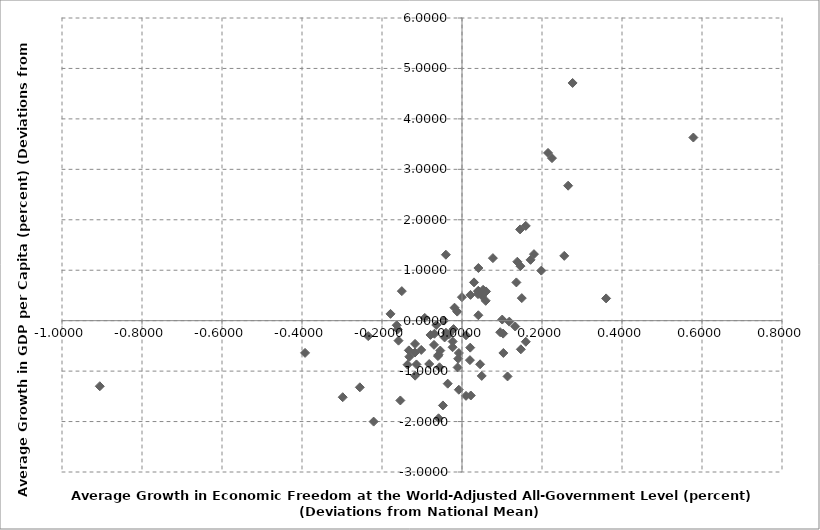
| Category | Series 0 |
|---|---|
| 0.021288192703214543 | 0.511 |
| -0.009559297445299944 | -0.755 |
| -0.06879234522613865 | -0.259 |
| -0.11760178874445776 | -0.632 |
| 0.2249677748700108 | 3.222 |
| -0.29816987386614185 | -1.518 |
| -0.22089651445889166 | -2.001 |
| -0.13157430311529078 | -0.715 |
| 0.02197545394083557 | -1.483 |
| 0.5783627013421597 | 3.631 |
| 0.01007309706503685 | -0.29 |
| 0.2653253572462967 | 2.676 |
| -0.11721318420313628 | -1.09 |
| 0.05923361363111331 | 0.393 |
| -0.023343085512058694 | -0.413 |
| -0.06015279793463984 | -0.702 |
| -0.15873594073875005 | -0.397 |
| -0.2554016548552477 | -1.321 |
| -0.15414060050880138 | -1.582 |
| -0.04765631381241243 | -1.681 |
| -0.044651745054410594 | 0.002 |
| 0.0493249994403578 | -1.096 |
| -0.04345265695179816 | -0.333 |
| -0.11732582455141802 | -0.461 |
| 0.04002176744183662 | 0.526 |
| -0.01199149164848182 | 0.18 |
| -0.23445224866889947 | -0.306 |
| 0.15942399856438233 | 1.879 |
| -0.08194344017499397 | -0.859 |
| -0.018678062132144492 | 0.257 |
| -0.1631684679766314 | -0.091 |
| -0.05859986500012463 | -1.936 |
| -0.06993558052962139 | -0.48 |
| -0.021093225080888543 | -0.167 |
| -0.13610917373049725 | -0.873 |
| 0.17143645503248311 | 1.205 |
| 0.1359456907535611 | 0.758 |
| 0.009967334116729037 | -1.491 |
| 0.020557688188553146 | -0.535 |
| -0.10193079974980135 | -0.58 |
| -0.05850241497910233 | -0.675 |
| 0.05047386329840673 | 0.489 |
| 0.019792913107188198 | -0.782 |
| 0.2764997428253679 | 4.712 |
| -0.02354258108157297 | -0.527 |
| 0.25565587076085927 | 1.285 |
| 0.17991238918849242 | 1.319 |
| -0.06428815019084935 | -0.086 |
| -0.07871502661252039 | -0.283 |
| -0.00797143062014902 | -1.369 |
| 0.04077031372476062 | 0.592 |
| -0.0561795674590717 | -0.924 |
| 0.13824446799410053 | 1.168 |
| 0.06013384494242728 | 0.579 |
| -0.16065739776788493 | -0.171 |
| -0.03259863088835328 | -0.269 |
| 0.10055365501861774 | 0.022 |
| 0.19830865673519615 | 0.992 |
| -0.05432924733296471 | -0.592 |
| 0.2151048866714614 | 3.325 |
| 0.052801318614018156 | 0.612 |
| 0.11389726822773928 | -1.106 |
| 0.09553929265487401 | -0.229 |
| 0.11830478415484273 | -0.019 |
| 0.36028361414927357 | 0.441 |
| -0.00786731647394491 | -0.641 |
| -0.9055578146898211 | -1.3 |
| -0.1504068096382928 | 0.586 |
| 0.07722255941364103 | 1.24 |
| 0.04530604662410914 | -0.865 |
| 0.10288597691802014 | -0.256 |
| 0.14709665240466308 | -0.568 |
| -0.010970111158851471 | -0.927 |
| 0.04086881978941197 | 0.107 |
| -0.00021366673828553812 | 0.466 |
| -0.39232706799744227 | -0.639 |
| 0.1594721772296315 | -0.418 |
| -0.040053408756110694 | -0.24 |
| -0.040336236346062225 | 1.307 |
| -0.11386650075425565 | -0.868 |
| 0.04007808006968954 | 0.582 |
| 0.14607470025086042 | 1.081 |
| 0.13303587856719723 | -0.115 |
| 0.040988648455498725 | 1.044 |
| -0.09309661182657601 | 0.054 |
| 0.03003549078514486 | 0.759 |
| -0.13287399226772656 | -0.589 |
| 0.10340597448689087 | -0.64 |
| -0.0357228005815348 | -1.249 |
| -0.17874614636980832 | 0.134 |
| 0.1494808895209271 | 0.447 |
| 0.1452603112822799 | 1.809 |